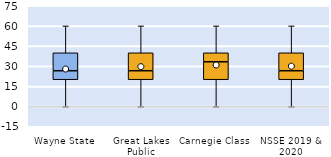
| Category | 25th | 50th | 75th |
|---|---|---|---|
| Wayne State | 20 | 6.667 | 13.333 |
| Great Lakes Public | 20 | 6.667 | 13.333 |
| Carnegie Class | 20 | 13.333 | 6.667 |
| NSSE 2019 & 2020 | 20 | 6.667 | 13.333 |